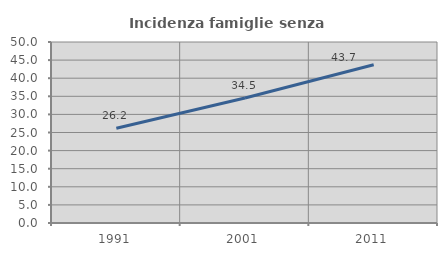
| Category | Incidenza famiglie senza nuclei |
|---|---|
| 1991.0 | 26.154 |
| 2001.0 | 34.527 |
| 2011.0 | 43.702 |